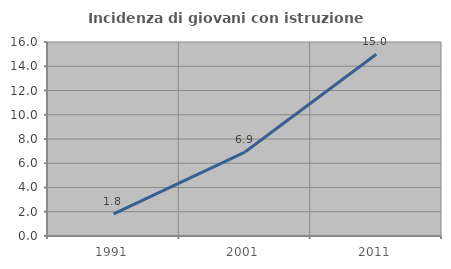
| Category | Incidenza di giovani con istruzione universitaria |
|---|---|
| 1991.0 | 1.826 |
| 2001.0 | 6.923 |
| 2011.0 | 14.99 |